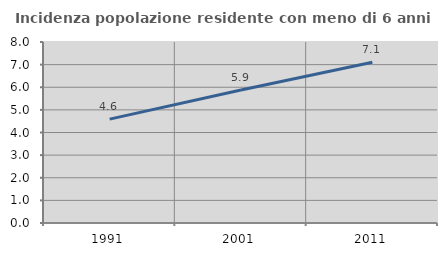
| Category | Incidenza popolazione residente con meno di 6 anni |
|---|---|
| 1991.0 | 4.591 |
| 2001.0 | 5.882 |
| 2011.0 | 7.101 |